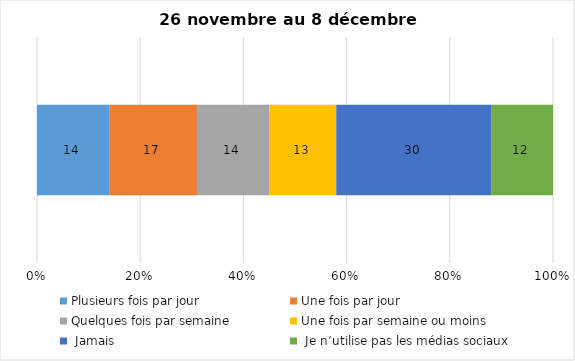
| Category | Plusieurs fois par jour | Une fois par jour | Quelques fois par semaine   | Une fois par semaine ou moins   |  Jamais   |  Je n’utilise pas les médias sociaux |
|---|---|---|---|---|---|---|
| 0 | 14 | 17 | 14 | 13 | 30 | 12 |